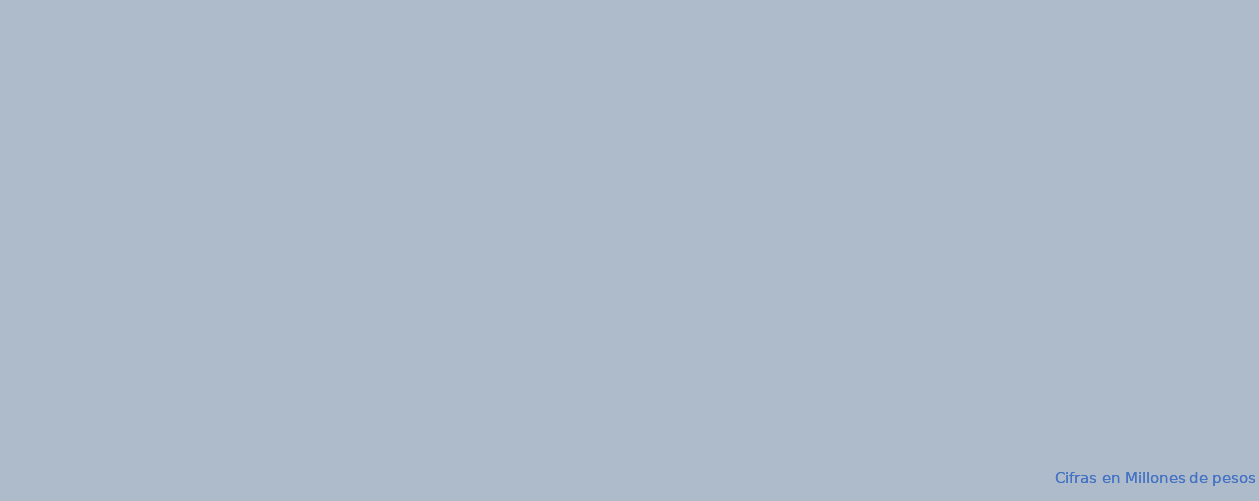
| Category | APROPIACION | COMPROMISOS |  OBLIGACIONES |  PAGOS |
|---|---|---|---|---|
| A-FUNCIONAMIENTO | 99785.985 | 39204.887 | 32118.097 | 30994.109 |
| B-SERVICIO DE LA DEUDA PÚBLICA | 1167604.335 | 680805.071 | 680805.071 | 680805.071 |
| C- INVERSION | 4505182.025 | 4337557.902 | 341258.587 | 340907.115 |